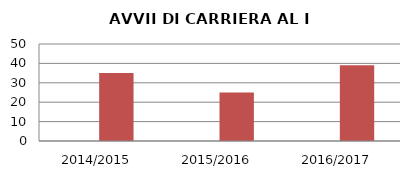
| Category | ANNO | NUMERO |
|---|---|---|
| 2014/2015 | 0 | 35 |
| 2015/2016 | 0 | 25 |
| 2016/2017 | 0 | 39 |